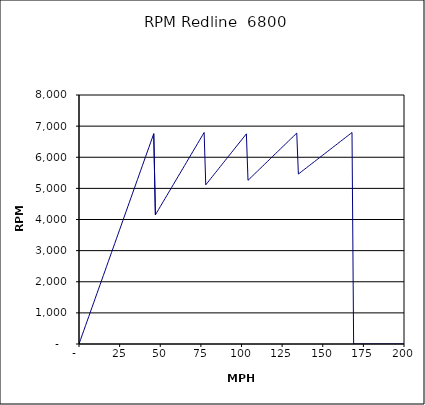
| Category | RPM Redline  6800 |
|---|---|
| 0.0 | 0 |
| 1.0 | 146.894 |
| 2.0 | 293.787 |
| 3.0 | 440.681 |
| 4.0 | 587.574 |
| 5.0 | 734.468 |
| 6.0 | 881.362 |
| 7.0 | 1028.255 |
| 8.0 | 1175.149 |
| 9.0 | 1322.042 |
| 10.0 | 1468.936 |
| 11.0 | 1615.83 |
| 12.0 | 1762.723 |
| 13.0 | 1909.617 |
| 14.0 | 2056.51 |
| 15.0 | 2203.404 |
| 16.0 | 2350.298 |
| 17.0 | 2497.191 |
| 18.0 | 2644.085 |
| 19.0 | 2790.978 |
| 20.0 | 2937.872 |
| 21.0 | 3084.766 |
| 22.0 | 3231.659 |
| 23.0 | 3378.553 |
| 24.0 | 3525.446 |
| 25.0 | 3672.34 |
| 26.0 | 3819.234 |
| 27.0 | 3966.127 |
| 28.0 | 4113.021 |
| 29.0 | 4259.914 |
| 30.0 | 4406.808 |
| 31.0 | 4553.702 |
| 32.0 | 4700.595 |
| 33.0 | 4847.489 |
| 34.0 | 4994.382 |
| 35.0 | 5141.276 |
| 36.0 | 5288.17 |
| 37.0 | 5435.063 |
| 38.0 | 5581.957 |
| 39.0 | 5728.85 |
| 40.0 | 5875.744 |
| 41.0 | 6022.638 |
| 42.0 | 6169.531 |
| 43.0 | 6316.425 |
| 44.0 | 6463.318 |
| 45.0 | 6610.212 |
| 46.0 | 6757.106 |
| 47.0 | 4147.717 |
| 48.0 | 4235.966 |
| 49.0 | 4324.216 |
| 50.0 | 4412.465 |
| 51.0 | 4500.714 |
| 52.0 | 4588.964 |
| 53.0 | 4677.213 |
| 54.0 | 4765.462 |
| 55.0 | 4853.711 |
| 56.0 | 4941.961 |
| 57.0 | 5030.21 |
| 58.0 | 5118.459 |
| 59.0 | 5206.709 |
| 60.0 | 5294.958 |
| 61.0 | 5383.207 |
| 62.0 | 5471.457 |
| 63.0 | 5559.706 |
| 64.0 | 5647.955 |
| 65.0 | 5736.204 |
| 66.0 | 5824.454 |
| 67.0 | 5912.703 |
| 68.0 | 6000.952 |
| 69.0 | 6089.202 |
| 70.0 | 6177.451 |
| 71.0 | 6265.7 |
| 72.0 | 6353.95 |
| 73.0 | 6442.199 |
| 74.0 | 6530.448 |
| 75.0 | 6618.697 |
| 76.0 | 6706.947 |
| 77.0 | 6795.196 |
| 78.0 | 5113.012 |
| 79.0 | 5178.563 |
| 80.0 | 5244.115 |
| 81.0 | 5309.666 |
| 82.0 | 5375.218 |
| 83.0 | 5440.769 |
| 84.0 | 5506.321 |
| 85.0 | 5571.872 |
| 86.0 | 5637.423 |
| 87.0 | 5702.975 |
| 88.0 | 5768.526 |
| 89.0 | 5834.078 |
| 90.0 | 5899.629 |
| 91.0 | 5965.181 |
| 92.0 | 6030.732 |
| 93.0 | 6096.283 |
| 94.0 | 6161.835 |
| 95.0 | 6227.386 |
| 96.0 | 6292.938 |
| 97.0 | 6358.489 |
| 98.0 | 6424.041 |
| 99.0 | 6489.592 |
| 100.0 | 6555.143 |
| 101.0 | 6620.695 |
| 102.0 | 6686.246 |
| 103.0 | 6751.798 |
| 104.0 | 5259.098 |
| 105.0 | 5309.666 |
| 106.0 | 5360.234 |
| 107.0 | 5410.803 |
| 108.0 | 5461.371 |
| 109.0 | 5511.939 |
| 110.0 | 5562.507 |
| 111.0 | 5613.076 |
| 112.0 | 5663.644 |
| 113.0 | 5714.212 |
| 114.0 | 5764.78 |
| 115.0 | 5815.349 |
| 116.0 | 5865.917 |
| 117.0 | 5916.485 |
| 118.0 | 5967.053 |
| 119.0 | 6017.622 |
| 120.0 | 6068.19 |
| 121.0 | 6118.758 |
| 122.0 | 6169.326 |
| 123.0 | 6219.895 |
| 124.0 | 6270.463 |
| 125.0 | 6321.031 |
| 126.0 | 6371.599 |
| 127.0 | 6422.168 |
| 128.0 | 6472.736 |
| 129.0 | 6523.304 |
| 130.0 | 6573.872 |
| 131.0 | 6624.441 |
| 132.0 | 6675.009 |
| 133.0 | 6725.577 |
| 134.0 | 6776.145 |
| 135.0 | 5460.425 |
| 136.0 | 5500.873 |
| 137.0 | 5541.321 |
| 138.0 | 5581.768 |
| 139.0 | 5622.216 |
| 140.0 | 5662.663 |
| 141.0 | 5703.111 |
| 142.0 | 5743.559 |
| 143.0 | 5784.006 |
| 144.0 | 5824.454 |
| 145.0 | 5864.901 |
| 146.0 | 5905.349 |
| 147.0 | 5945.797 |
| 148.0 | 5986.244 |
| 149.0 | 6026.692 |
| 150.0 | 6067.139 |
| 151.0 | 6107.587 |
| 152.0 | 6148.035 |
| 153.0 | 6188.482 |
| 154.0 | 6228.93 |
| 155.0 | 6269.377 |
| 156.0 | 6309.825 |
| 157.0 | 6350.273 |
| 158.0 | 6390.72 |
| 159.0 | 6431.168 |
| 160.0 | 6471.615 |
| 161.0 | 6512.063 |
| 162.0 | 6552.511 |
| 163.0 | 6592.958 |
| 164.0 | 6633.406 |
| 165.0 | 6673.853 |
| 166.0 | 6714.301 |
| 167.0 | 6754.748 |
| 168.0 | 6795.196 |
| 169.0 | 0 |
| 170.0 | 0 |
| 171.0 | 0 |
| 172.0 | 0 |
| 173.0 | 0 |
| 174.0 | 0 |
| 175.0 | 0 |
| 176.0 | 0 |
| 177.0 | 0 |
| 178.0 | 0 |
| 179.0 | 0 |
| 180.0 | 0 |
| 181.0 | 0 |
| 182.0 | 0 |
| 183.0 | 0 |
| 184.0 | 0 |
| 185.0 | 0 |
| 186.0 | 0 |
| 187.0 | 0 |
| 188.0 | 0 |
| 189.0 | 0 |
| 190.0 | 0 |
| 191.0 | 0 |
| 192.0 | 0 |
| 193.0 | 0 |
| 194.0 | 0 |
| 195.0 | 0 |
| 196.0 | 0 |
| 197.0 | 0 |
| 198.0 | 0 |
| 199.0 | 0 |
| 200.0 | 0 |